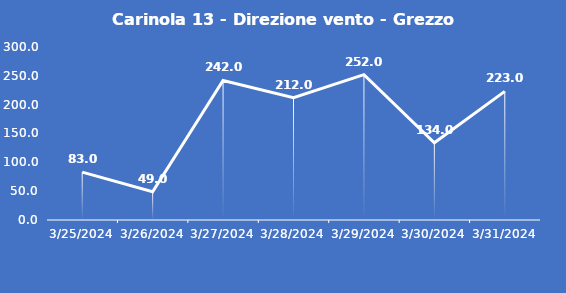
| Category | Carinola 13 - Direzione vento - Grezzo (°N) |
|---|---|
| 3/25/24 | 83 |
| 3/26/24 | 49 |
| 3/27/24 | 242 |
| 3/28/24 | 212 |
| 3/29/24 | 252 |
| 3/30/24 | 134 |
| 3/31/24 | 223 |